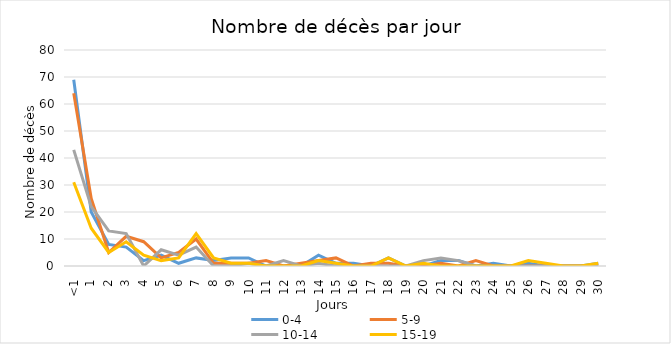
| Category | 0-4 | 5-9 | 10-14 | 15-19 |
|---|---|---|---|---|
| <1 | 69 | 64 | 43 | 31 |
| 1 | 20 | 25 | 22 | 14 |
| 2 | 8 | 5 | 13 | 5 |
| 3 | 7 | 11 | 12 | 9 |
| 4 | 2 | 9 | 0 | 4 |
| 5 | 4 | 3 | 6 | 2 |
| 6 | 1 | 5 | 4 | 3 |
| 7 | 3 | 10 | 7 | 12 |
| 8 | 2 | 1 | 0 | 3 |
| 9 | 3 | 1 | 0 | 1 |
| 10 | 3 | 1 | 1 | 1 |
| 11 | 0 | 2 | 0 | 0 |
| 12 | 0 | 0 | 2 | 0 |
| 13 | 0 | 1 | 0 | 0 |
| 14 | 4 | 2 | 1 | 2 |
| 15 | 1 | 3 | 0 | 1 |
| 16 | 1 | 0 | 0 | 0 |
| 17 | 0 | 1 | 0 | 0 |
| 18 | 3 | 1 | 0 | 3 |
| 19 | 0 | 0 | 0 | 0 |
| 20 | 0 | 0 | 2 | 1 |
| 21 | 2 | 1 | 3 | 0 |
| 22 | 2 | 0 | 2 | 0 |
| 23 | 0 | 2 | 0 | 0 |
| 24 | 1 | 0 | 0 | 0 |
| 25 | 0 | 0 | 0 | 0 |
| 26 | 1 | 0 | 0 | 2 |
| 27 | 0 | 0 | 0 | 1 |
| 28 | 0 | 0 | 0 | 0 |
| 29 | 0 | 0 | 0 | 0 |
| 30 | 1 | 0 | 0 | 1 |